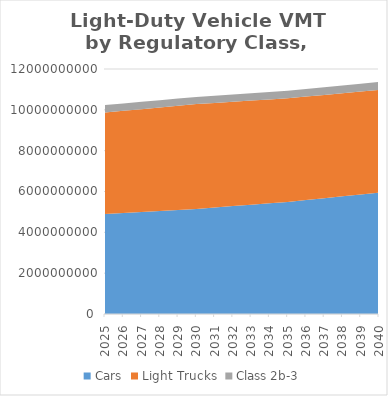
| Category | Cars | Light Trucks | Class 2b-3 |
|---|---|---|---|
| 2025.0 | 4897220033.231 | 4968780042 | 370981136.615 |
| 2026.0 | 4947560254.385 | 5002028178 | 366215991.692 |
| 2027.0 | 4997900475.538 | 5035276314 | 361450846.769 |
| 2028.0 | 5048240696.692 | 5068524450 | 356685701.846 |
| 2029.0 | 5098580917.846 | 5101772586 | 351920556.923 |
| 2030.0 | 5148921139 | 5135020722 | 347155412 |
| 2031.0 | 5217116494.973 | 5123550608.611 | 351358584.172 |
| 2032.0 | 5285311850.946 | 5112080495.222 | 355561756.344 |
| 2033.0 | 5353507206.919 | 5100610381.832 | 359764928.516 |
| 2034.0 | 5421702562.891 | 5089140268.443 | 363968100.688 |
| 2035.0 | 5489897918.864 | 5077670155.054 | 368171272.86 |
| 2036.0 | 5580944083.491 | 5067913732.043 | 372402150.288 |
| 2037.0 | 5671990248.119 | 5058157309.032 | 376633027.716 |
| 2038.0 | 5763036412.746 | 5048400886.022 | 380863905.144 |
| 2039.0 | 5854082577.373 | 5038644463.011 | 385094782.572 |
| 2040.0 | 5945128742 | 5028888040 | 389325660 |